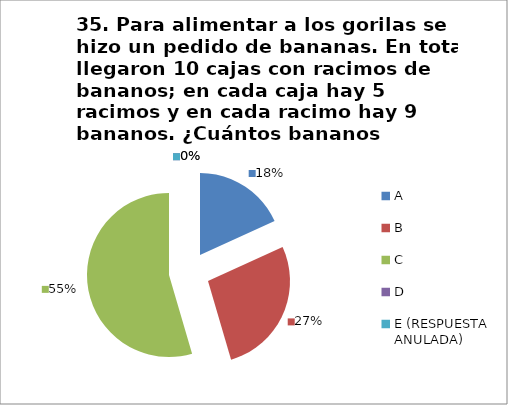
| Category | CANTIDAD DE RESPUESTAS PREGUNTA (35) | PORCENTAJE |
|---|---|---|
| A | 4 | 0.182 |
| B | 6 | 0.273 |
| C | 12 | 0.545 |
| D | 0 | 0 |
| E (RESPUESTA ANULADA) | 0 | 0 |